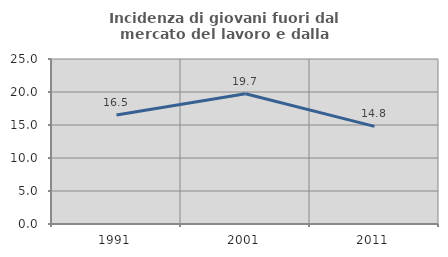
| Category | Incidenza di giovani fuori dal mercato del lavoro e dalla formazione  |
|---|---|
| 1991.0 | 16.502 |
| 2001.0 | 19.732 |
| 2011.0 | 14.796 |